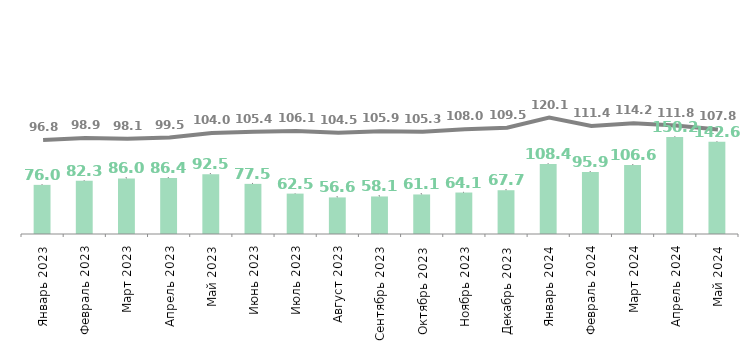
| Category | C |
|---|---|
| Январь 2023 | 75.966 |
| Февраль 2023 | 82.29 |
| Март 2023 | 85.961 |
| Апрель 2023 | 86.447 |
| Май 2023 | 92.525 |
| Июнь 2023 | 77.527 |
| Июль 2023 | 62.468 |
| Август 2023 | 56.578 |
| Сентябрь 2023 | 58.054 |
| Октябрь 2023 | 61.141 |
| Ноябрь 2023 | 64.138 |
| Декабрь 2023 | 67.678 |
| Январь 2024 | 108.402 |
| Февраль 2024 | 95.873 |
| Март 2024 | 106.594 |
| Апрель 2024 | 150.176 |
| Май 2024 | 142.623 |